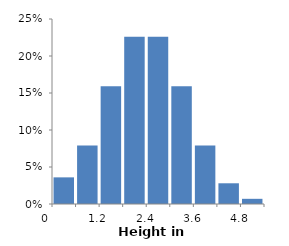
| Category | Height histogram |
|---|---|
| 0           | 0.036 |
| 0.6           | 0.079 |
| 1.2           | 0.159 |
| 1.8           | 0.226 |
| 2.4           | 0.226 |
| 3           | 0.159 |
| 3.6           | 0.079 |
| 4.2           | 0.028 |
| 4.8           | 0.007 |